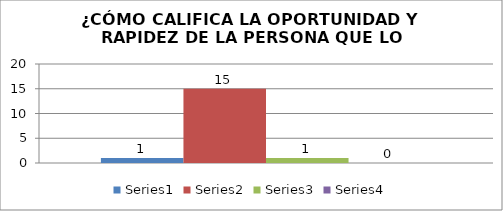
| Category | Series 0 | Series 1 | Series 2 | Series 3 |
|---|---|---|---|---|
| 0 | 1 | 15 | 1 | 0 |